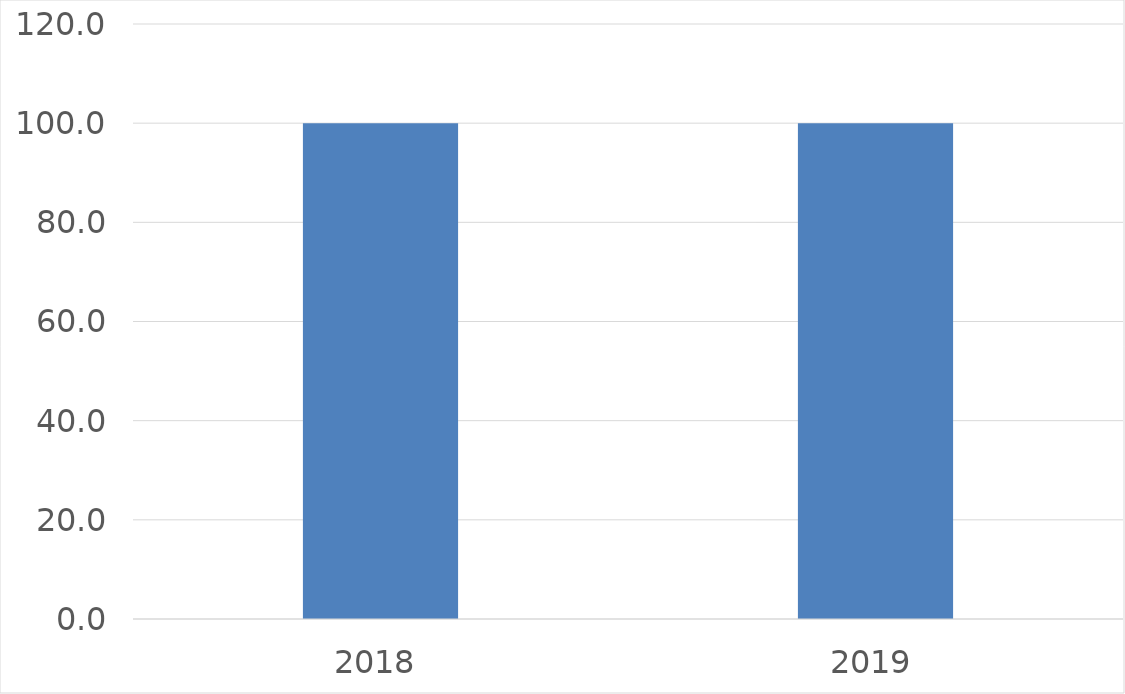
| Category | Series 0 |
|---|---|
| 2018 | 100 |
| 2019 | 100 |